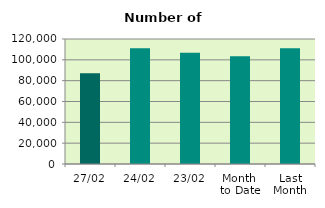
| Category | Series 0 |
|---|---|
| 27/02 | 87054 |
| 24/02 | 111094 |
| 23/02 | 106688 |
| Month 
to Date | 103471.474 |
| Last
Month | 111077.545 |